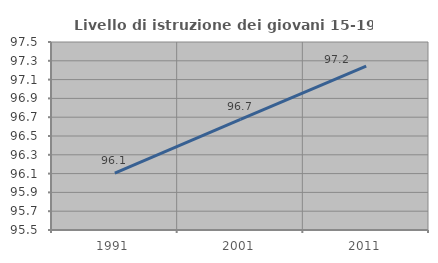
| Category | Livello di istruzione dei giovani 15-19 anni |
|---|---|
| 1991.0 | 96.104 |
| 2001.0 | 96.678 |
| 2011.0 | 97.244 |